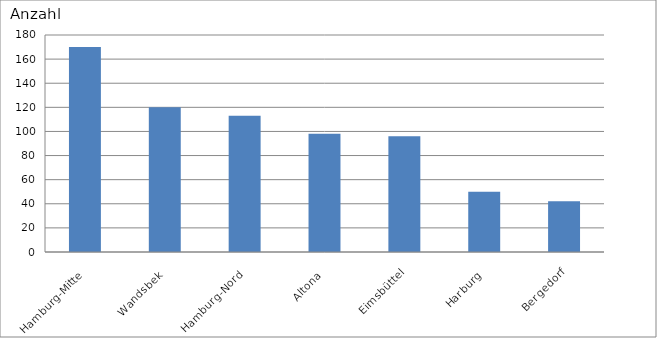
| Category | Hamburg-Mitte Wandsbek Hamburg-Nord Altona Eimsbüttel Harburg Bergedorf |
|---|---|
| Hamburg-Mitte | 170 |
| Wandsbek | 120 |
| Hamburg-Nord | 113 |
| Altona | 98 |
| Eimsbüttel | 96 |
| Harburg | 50 |
| Bergedorf | 42 |